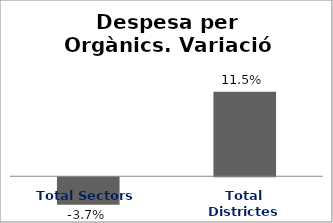
| Category | Series 0 |
|---|---|
| Total Sectors | -0.037 |
| Total Districtes | 0.115 |